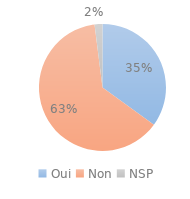
| Category | Series 0 |
|---|---|
| Oui | 0.35 |
| Non | 0.63 |
| NSP | 0.02 |